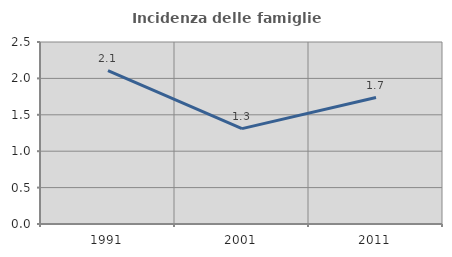
| Category | Incidenza delle famiglie numerose |
|---|---|
| 1991.0 | 2.106 |
| 2001.0 | 1.31 |
| 2011.0 | 1.736 |